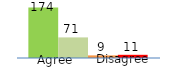
| Category | Series 0 | Series 1 | Series 2 | Series 3 |
|---|---|---|---|---|
| 0 | 174 | 71 | 9 | 11 |